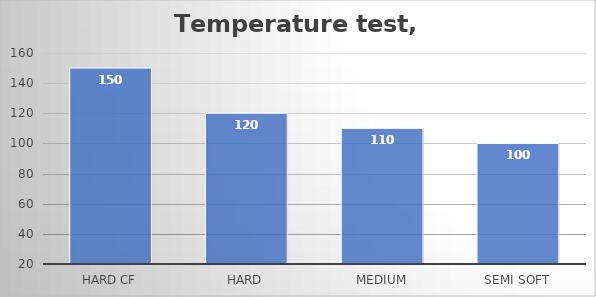
| Category | °C |
|---|---|
| Hard CF | 150 |
| Hard | 120 |
| Medium | 110 |
| Semi soft | 100 |